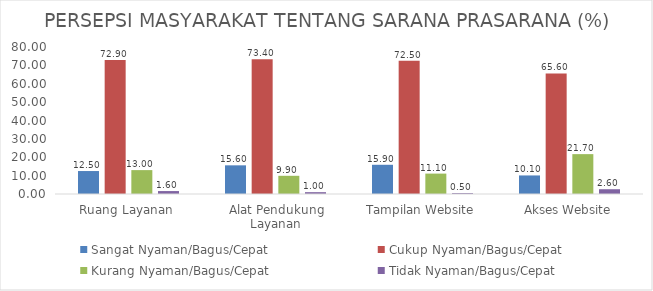
| Category | Sangat Nyaman/Bagus/Cepat | Cukup Nyaman/Bagus/Cepat | Kurang Nyaman/Bagus/Cepat | Tidak Nyaman/Bagus/Cepat |
|---|---|---|---|---|
| Ruang Layanan | 12.5 | 72.9 | 13 | 1.6 |
| Alat Pendukung Layanan | 15.6 | 73.4 | 9.9 | 1 |
| Tampilan Website | 15.9 | 72.5 | 11.1 | 0.5 |
| Akses Website | 10.1 | 65.6 | 21.7 | 2.6 |